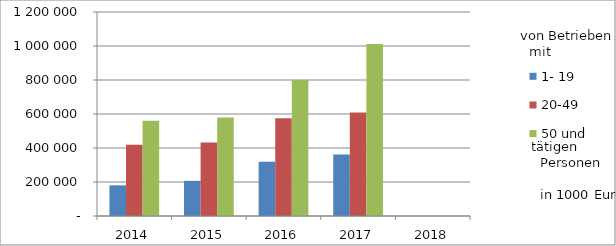
| Category | 1- 19 | 20-49 | 50 und mehr |
|---|---|---|---|
| 2014.0 | 180326.18 | 418921.142 | 560768.499 |
| 2015.0 | 206882.453 | 432377.754 | 578872.572 |
| 2016.0 | 319340.725 | 575670.955 | 800299.036 |
| 2017.0 | 362148.834 | 608159.206 | 1012092.607 |
| 2018.0 | 0 | 0 | 0 |